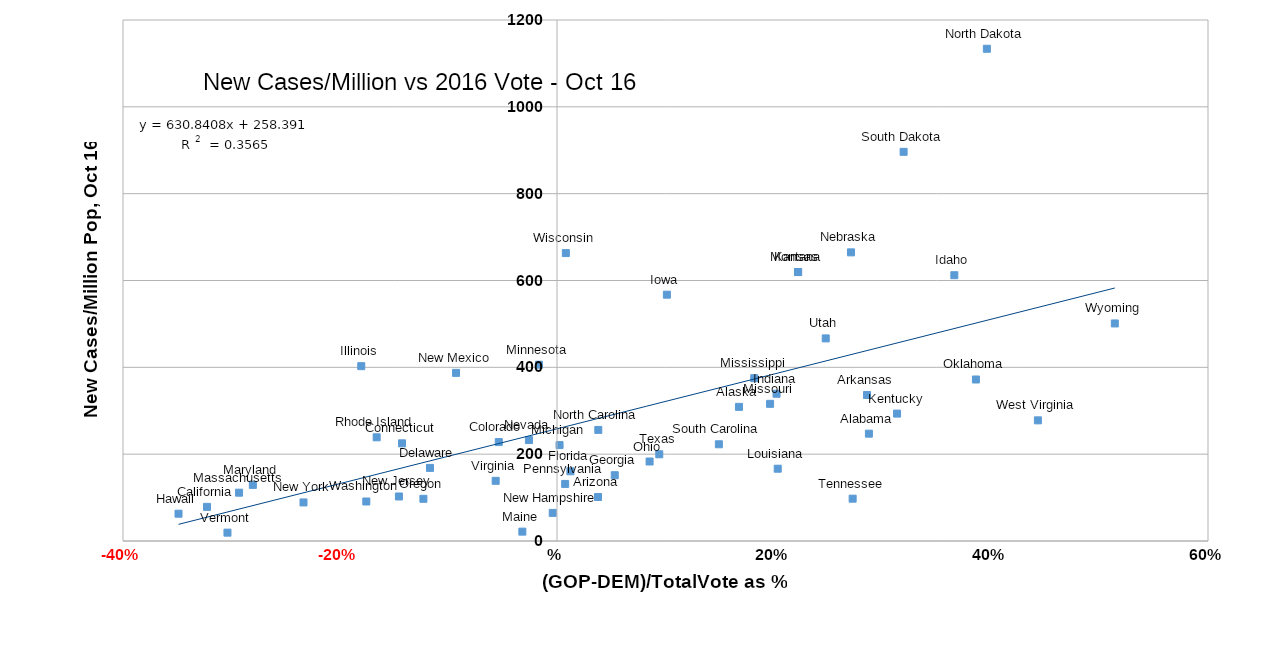
| Category | NewCases/M |
|---|---|
| 0.396184857930395 | 1133.766 |
| 0.319458890952446 | 896.391 |
| 0.270953482263551 | 664.803 |
| 0.0081597807605943 | 663.125 |
| 0.222229406852133 | 619.569 |
| 0.222193286340489 | 619.399 |
| 0.366203533616112 | 612.177 |
| 0.101270956902407 | 567.341 |
| 0.514106392583076 | 501.072 |
| 0.247673164169816 | 466.631 |
| -0.0166371386723069 | 406.055 |
| -0.18040102781423 | 402.705 |
| -0.0930174492835863 | 387.251 |
| 0.181796946481201 | 374.981 |
| 0.386094744766563 | 372.002 |
| 0.202346190490161 | 339.116 |
| 0.285702753795409 | 336.337 |
| 0.196371219911321 | 315.93 |
| 0.167713094221361 | 308.935 |
| 0.313412580350197 | 293.441 |
| 0.443221045025916 | 277.879 |
| 0.0380749160743743 | 255.909 |
| 0.287482871879215 | 247.186 |
| -0.166214081853196 | 238.823 |
| -0.025874188399704 | 232.456 |
| -0.0536666674536487 | 227.828 |
| -0.142830950345273 | 224.947 |
| 0.14920512721048 | 222.774 |
| 0.00235336433923096 | 220.89 |
| 0.0942645115594397 | 199.718 |
| 0.0853536915427181 | 183.077 |
| -0.117060261612521 | 168.419 |
| 0.203433544756156 | 166.495 |
| 0.0123767094555096 | 160.585 |
| 0.0532234519860643 | 151.543 |
| -0.056527525543094 | 138.597 |
| 0.00751071614980328 | 131.464 |
| -0.280324993695388 | 129.183 |
| -0.29302557379259 | 111.28 |
| -0.145683802858026 | 102.565 |
| 0.0378004680207891 | 101.391 |
| 0.27248686090524 | 97.523 |
| -0.123116778901087 | 97.209 |
| -0.175738624001295 | 91.006 |
| -0.233629490703812 | 88.827 |
| -0.322564410854598 | 78.634 |
| -0.00394056884761405 | 64.72 |
| -0.348826749010709 | 62.859 |
| -0.0319358225832506 | 21.574 |
| -0.303728526476407 | 19.231 |